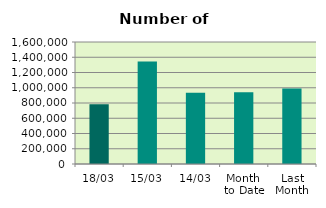
| Category | Series 0 |
|---|---|
| 18/03 | 784412 |
| 15/03 | 1345192 |
| 14/03 | 933086 |
| Month 
to Date | 941615.5 |
| Last
Month | 989849.1 |